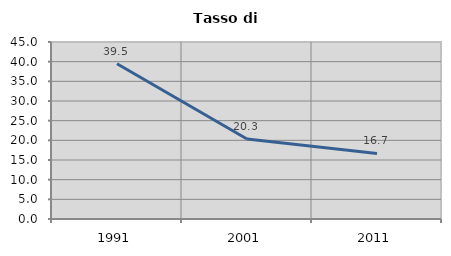
| Category | Tasso di disoccupazione   |
|---|---|
| 1991.0 | 39.459 |
| 2001.0 | 20.342 |
| 2011.0 | 16.659 |